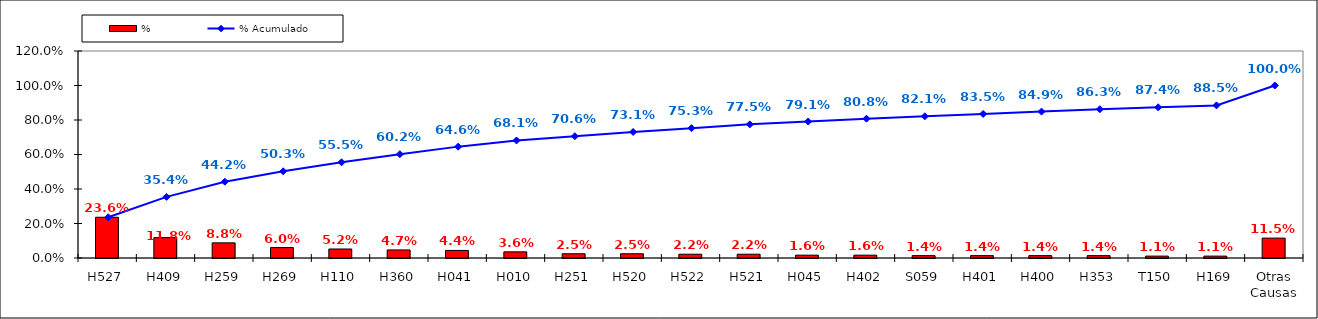
| Category | % |
|---|---|
| H527 | 0.236 |
| H409 | 0.118 |
| H259 | 0.088 |
| H269 | 0.06 |
| H110 | 0.052 |
| H360 | 0.047 |
| H041 | 0.044 |
| H010 | 0.036 |
| H251 | 0.025 |
| H520 | 0.025 |
| H522 | 0.022 |
| H521 | 0.022 |
| H045 | 0.016 |
| H402 | 0.016 |
| S059 | 0.014 |
| H401 | 0.014 |
| H400 | 0.014 |
| H353 | 0.014 |
| T150 | 0.011 |
| H169 | 0.011 |
| Otras Causas | 0.115 |